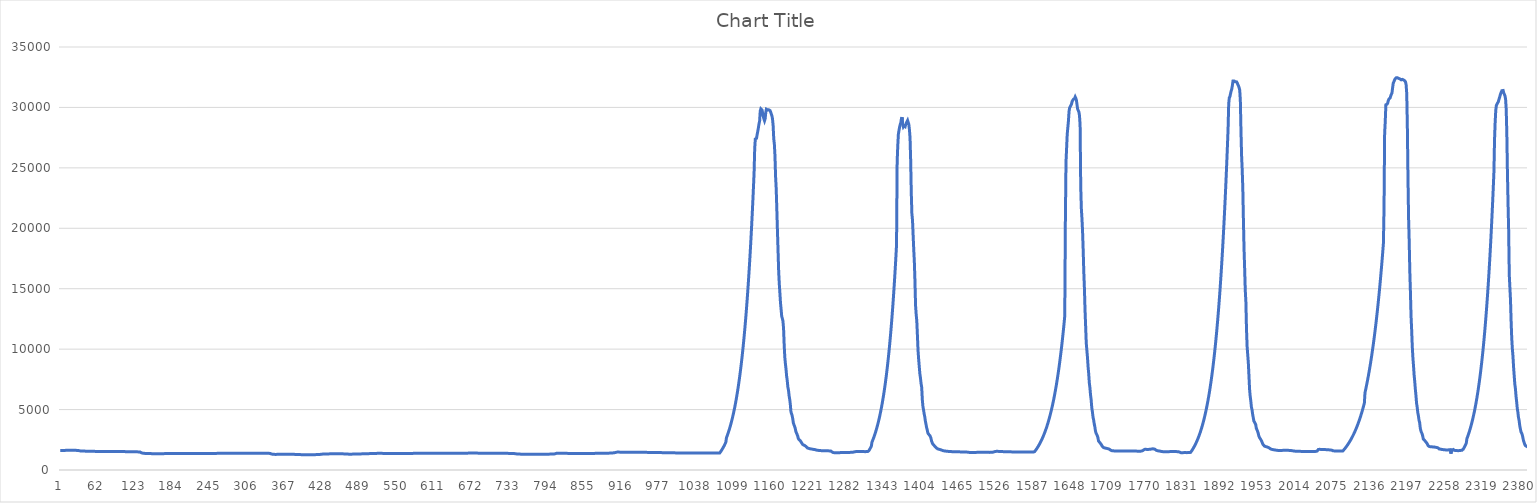
| Category | Series 0 |
|---|---|
| 0 | 1616 |
| 1 | 1617 |
| 2 | 1613 |
| 3 | 1615 |
| 4 | 1622 |
| 5 | 1622 |
| 6 | 1619 |
| 7 | 1623 |
| 8 | 1623 |
| 9 | 1626 |
| 10 | 1627 |
| 11 | 1625 |
| 12 | 1624 |
| 13 | 1625 |
| 14 | 1627 |
| 15 | 1626 |
| 16 | 1627 |
| 17 | 1627 |
| 18 | 1628 |
| 19 | 1628 |
| 20 | 1628 |
| 21 | 1628 |
| 22 | 1627 |
| 23 | 1627 |
| 24 | 1625 |
| 25 | 1623 |
| 26 | 1624 |
| 27 | 1622 |
| 28 | 1616 |
| 29 | 1611 |
| 30 | 1605 |
| 31 | 1596 |
| 32 | 1583 |
| 33 | 1577 |
| 34 | 1572 |
| 35 | 1569 |
| 36 | 1571 |
| 37 | 1567 |
| 38 | 1565 |
| 39 | 1562 |
| 40 | 1563 |
| 41 | 1561 |
| 42 | 1557 |
| 43 | 1554 |
| 44 | 1554 |
| 45 | 1551 |
| 46 | 1548 |
| 47 | 1545 |
| 48 | 1545 |
| 49 | 1547 |
| 50 | 1545 |
| 51 | 1546 |
| 52 | 1546 |
| 53 | 1543 |
| 54 | 1541 |
| 55 | 1541 |
| 56 | 1542 |
| 57 | 1541 |
| 58 | 1538 |
| 59 | 1538 |
| 60 | 1535 |
| 61 | 1535 |
| 62 | 1533 |
| 63 | 1532 |
| 64 | 1531 |
| 65 | 1531 |
| 66 | 1529 |
| 67 | 1528 |
| 68 | 1526 |
| 69 | 1525 |
| 70 | 1524 |
| 71 | 1523 |
| 72 | 1524 |
| 73 | 1524 |
| 74 | 1525 |
| 75 | 1527 |
| 76 | 1526 |
| 77 | 1527 |
| 78 | 1528 |
| 79 | 1528 |
| 80 | 1529 |
| 81 | 1529 |
| 82 | 1529 |
| 83 | 1530 |
| 84 | 1530 |
| 85 | 1531 |
| 86 | 1530 |
| 87 | 1531 |
| 88 | 1531 |
| 89 | 1531 |
| 90 | 1530 |
| 91 | 1531 |
| 92 | 1531 |
| 93 | 1530 |
| 94 | 1530 |
| 95 | 1529 |
| 96 | 1529 |
| 97 | 1528 |
| 98 | 1529 |
| 99 | 1529 |
| 100 | 1528 |
| 101 | 1528 |
| 102 | 1527 |
| 103 | 1527 |
| 104 | 1525 |
| 105 | 1524 |
| 106 | 1519 |
| 107 | 1510 |
| 108 | 1506 |
| 109 | 1501 |
| 110 | 1500 |
| 111 | 1498 |
| 112 | 1502 |
| 113 | 1505 |
| 114 | 1508 |
| 115 | 1510 |
| 116 | 1511 |
| 117 | 1509 |
| 118 | 1510 |
| 119 | 1511 |
| 120 | 1513 |
| 121 | 1511 |
| 122 | 1512 |
| 123 | 1510 |
| 124 | 1507 |
| 125 | 1503 |
| 126 | 1500 |
| 127 | 1497 |
| 128 | 1494 |
| 129 | 1490 |
| 130 | 1486 |
| 131 | 1474 |
| 132 | 1424 |
| 133 | 1412 |
| 134 | 1396 |
| 135 | 1385 |
| 136 | 1380 |
| 137 | 1377 |
| 138 | 1373 |
| 139 | 1371 |
| 140 | 1367 |
| 141 | 1368 |
| 142 | 1365 |
| 143 | 1366 |
| 144 | 1365 |
| 145 | 1363 |
| 146 | 1360 |
| 147 | 1357 |
| 148 | 1355 |
| 149 | 1354 |
| 150 | 1353 |
| 151 | 1352 |
| 152 | 1351 |
| 153 | 1348 |
| 154 | 1348 |
| 155 | 1348 |
| 156 | 1347 |
| 157 | 1347 |
| 158 | 1345 |
| 159 | 1345 |
| 160 | 1345 |
| 161 | 1346 |
| 162 | 1348 |
| 163 | 1351 |
| 164 | 1352 |
| 165 | 1354 |
| 166 | 1354 |
| 167 | 1354 |
| 168 | 1354 |
| 169 | 1354 |
| 170 | 1355 |
| 171 | 1355 |
| 172 | 1355 |
| 173 | 1355 |
| 174 | 1355 |
| 175 | 1356 |
| 176 | 1355 |
| 177 | 1356 |
| 178 | 1355 |
| 179 | 1355 |
| 180 | 1355 |
| 181 | 1355 |
| 182 | 1355 |
| 183 | 1356 |
| 184 | 1356 |
| 185 | 1355 |
| 186 | 1356 |
| 187 | 1355 |
| 188 | 1355 |
| 189 | 1355 |
| 190 | 1355 |
| 191 | 1355 |
| 192 | 1356 |
| 193 | 1357 |
| 194 | 1357 |
| 195 | 1358 |
| 196 | 1358 |
| 197 | 1359 |
| 198 | 1359 |
| 199 | 1360 |
| 200 | 1361 |
| 201 | 1361 |
| 202 | 1361 |
| 203 | 1362 |
| 204 | 1362 |
| 205 | 1362 |
| 206 | 1363 |
| 207 | 1364 |
| 208 | 1364 |
| 209 | 1365 |
| 210 | 1365 |
| 211 | 1365 |
| 212 | 1365 |
| 213 | 1365 |
| 214 | 1365 |
| 215 | 1364 |
| 216 | 1365 |
| 217 | 1365 |
| 218 | 1365 |
| 219 | 1366 |
| 220 | 1367 |
| 221 | 1367 |
| 222 | 1366 |
| 223 | 1367 |
| 224 | 1367 |
| 225 | 1367 |
| 226 | 1367 |
| 227 | 1367 |
| 228 | 1368 |
| 229 | 1368 |
| 230 | 1368 |
| 231 | 1368 |
| 232 | 1369 |
| 233 | 1369 |
| 234 | 1369 |
| 235 | 1369 |
| 236 | 1370 |
| 237 | 1368 |
| 238 | 1369 |
| 239 | 1368 |
| 240 | 1369 |
| 241 | 1369 |
| 242 | 1369 |
| 243 | 1370 |
| 244 | 1370 |
| 245 | 1370 |
| 246 | 1371 |
| 247 | 1371 |
| 248 | 1372 |
| 249 | 1372 |
| 250 | 1372 |
| 251 | 1373 |
| 252 | 1374 |
| 253 | 1375 |
| 254 | 1375 |
| 255 | 1376 |
| 256 | 1376 |
| 257 | 1376 |
| 258 | 1377 |
| 259 | 1378 |
| 260 | 1379 |
| 261 | 1380 |
| 262 | 1381 |
| 263 | 1382 |
| 264 | 1385 |
| 265 | 1387 |
| 266 | 1389 |
| 267 | 1391 |
| 268 | 1391 |
| 269 | 1392 |
| 270 | 1394 |
| 271 | 1395 |
| 272 | 1395 |
| 273 | 1395 |
| 274 | 1393 |
| 275 | 1395 |
| 276 | 1395 |
| 277 | 1396 |
| 278 | 1395 |
| 279 | 1394 |
| 280 | 1394 |
| 281 | 1393 |
| 282 | 1391 |
| 283 | 1390 |
| 284 | 1389 |
| 285 | 1388 |
| 286 | 1387 |
| 287 | 1387 |
| 288 | 1386 |
| 289 | 1385 |
| 290 | 1383 |
| 291 | 1382 |
| 292 | 1381 |
| 293 | 1380 |
| 294 | 1379 |
| 295 | 1379 |
| 296 | 1379 |
| 297 | 1378 |
| 298 | 1378 |
| 299 | 1377 |
| 300 | 1377 |
| 301 | 1377 |
| 302 | 1378 |
| 303 | 1378 |
| 304 | 1378 |
| 305 | 1378 |
| 306 | 1378 |
| 307 | 1379 |
| 308 | 1380 |
| 309 | 1381 |
| 310 | 1381 |
| 311 | 1383 |
| 312 | 1383 |
| 313 | 1384 |
| 314 | 1385 |
| 315 | 1385 |
| 316 | 1387 |
| 317 | 1387 |
| 318 | 1387 |
| 319 | 1387 |
| 320 | 1388 |
| 321 | 1388 |
| 322 | 1388 |
| 323 | 1388 |
| 324 | 1389 |
| 325 | 1389 |
| 326 | 1389 |
| 327 | 1389 |
| 328 | 1389 |
| 329 | 1389 |
| 330 | 1389 |
| 331 | 1388 |
| 332 | 1388 |
| 333 | 1387 |
| 334 | 1387 |
| 335 | 1386 |
| 336 | 1385 |
| 337 | 1384 |
| 338 | 1383 |
| 339 | 1381 |
| 340 | 1379 |
| 341 | 1377 |
| 342 | 1367 |
| 343 | 1319 |
| 344 | 1318 |
| 345 | 1316 |
| 346 | 1308 |
| 347 | 1295 |
| 348 | 1294 |
| 349 | 1290 |
| 350 | 1292 |
| 351 | 1293 |
| 352 | 1292 |
| 353 | 1294 |
| 354 | 1297 |
| 355 | 1298 |
| 356 | 1298 |
| 357 | 1298 |
| 358 | 1300 |
| 359 | 1302 |
| 360 | 1302 |
| 361 | 1303 |
| 362 | 1304 |
| 363 | 1305 |
| 364 | 1305 |
| 365 | 1306 |
| 366 | 1307 |
| 367 | 1306 |
| 368 | 1307 |
| 369 | 1305 |
| 370 | 1303 |
| 371 | 1303 |
| 372 | 1303 |
| 373 | 1303 |
| 374 | 1301 |
| 375 | 1301 |
| 376 | 1299 |
| 377 | 1298 |
| 378 | 1297 |
| 379 | 1296 |
| 380 | 1296 |
| 381 | 1295 |
| 382 | 1292 |
| 383 | 1291 |
| 384 | 1289 |
| 385 | 1287 |
| 386 | 1285 |
| 387 | 1284 |
| 388 | 1281 |
| 389 | 1280 |
| 390 | 1277 |
| 391 | 1275 |
| 392 | 1271 |
| 393 | 1269 |
| 394 | 1266 |
| 395 | 1262 |
| 396 | 1262 |
| 397 | 1261 |
| 398 | 1261 |
| 399 | 1262 |
| 400 | 1263 |
| 401 | 1262 |
| 402 | 1262 |
| 403 | 1262 |
| 404 | 1261 |
| 405 | 1261 |
| 406 | 1262 |
| 407 | 1263 |
| 408 | 1263 |
| 409 | 1263 |
| 410 | 1264 |
| 411 | 1266 |
| 412 | 1268 |
| 413 | 1269 |
| 414 | 1270 |
| 415 | 1270 |
| 416 | 1272 |
| 417 | 1273 |
| 418 | 1273 |
| 419 | 1274 |
| 420 | 1278 |
| 421 | 1280 |
| 422 | 1284 |
| 423 | 1293 |
| 424 | 1296 |
| 425 | 1306 |
| 426 | 1310 |
| 427 | 1314 |
| 428 | 1318 |
| 429 | 1324 |
| 430 | 1324 |
| 431 | 1324 |
| 432 | 1328 |
| 433 | 1327 |
| 434 | 1326 |
| 435 | 1329 |
| 436 | 1331 |
| 437 | 1332 |
| 438 | 1334 |
| 439 | 1334 |
| 440 | 1336 |
| 441 | 1337 |
| 442 | 1339 |
| 443 | 1340 |
| 444 | 1340 |
| 445 | 1342 |
| 446 | 1342 |
| 447 | 1342 |
| 448 | 1342 |
| 449 | 1342 |
| 450 | 1342 |
| 451 | 1342 |
| 452 | 1342 |
| 453 | 1341 |
| 454 | 1340 |
| 455 | 1340 |
| 456 | 1340 |
| 457 | 1338 |
| 458 | 1337 |
| 459 | 1336 |
| 460 | 1336 |
| 461 | 1335 |
| 462 | 1333 |
| 463 | 1333 |
| 464 | 1331 |
| 465 | 1329 |
| 466 | 1328 |
| 467 | 1325 |
| 468 | 1319 |
| 469 | 1316 |
| 470 | 1309 |
| 471 | 1308 |
| 472 | 1309 |
| 473 | 1308 |
| 474 | 1309 |
| 475 | 1311 |
| 476 | 1315 |
| 477 | 1319 |
| 478 | 1321 |
| 479 | 1321 |
| 480 | 1325 |
| 481 | 1325 |
| 482 | 1326 |
| 483 | 1327 |
| 484 | 1328 |
| 485 | 1329 |
| 486 | 1332 |
| 487 | 1331 |
| 488 | 1332 |
| 489 | 1334 |
| 490 | 1333 |
| 491 | 1335 |
| 492 | 1336 |
| 493 | 1337 |
| 494 | 1338 |
| 495 | 1340 |
| 496 | 1341 |
| 497 | 1342 |
| 498 | 1343 |
| 499 | 1344 |
| 500 | 1347 |
| 501 | 1349 |
| 502 | 1352 |
| 503 | 1354 |
| 504 | 1357 |
| 505 | 1358 |
| 506 | 1360 |
| 507 | 1363 |
| 508 | 1366 |
| 509 | 1368 |
| 510 | 1369 |
| 511 | 1371 |
| 512 | 1372 |
| 513 | 1373 |
| 514 | 1373 |
| 515 | 1374 |
| 516 | 1376 |
| 517 | 1377 |
| 518 | 1376 |
| 519 | 1377 |
| 520 | 1376 |
| 521 | 1376 |
| 522 | 1377 |
| 523 | 1376 |
| 524 | 1376 |
| 525 | 1374 |
| 526 | 1374 |
| 527 | 1373 |
| 528 | 1372 |
| 529 | 1371 |
| 530 | 1370 |
| 531 | 1368 |
| 532 | 1368 |
| 533 | 1367 |
| 534 | 1367 |
| 535 | 1367 |
| 536 | 1367 |
| 537 | 1367 |
| 538 | 1367 |
| 539 | 1367 |
| 540 | 1368 |
| 541 | 1368 |
| 542 | 1367 |
| 543 | 1367 |
| 544 | 1367 |
| 545 | 1365 |
| 546 | 1364 |
| 547 | 1364 |
| 548 | 1364 |
| 549 | 1364 |
| 550 | 1365 |
| 551 | 1365 |
| 552 | 1366 |
| 553 | 1365 |
| 554 | 1365 |
| 555 | 1365 |
| 556 | 1365 |
| 557 | 1366 |
| 558 | 1366 |
| 559 | 1366 |
| 560 | 1367 |
| 561 | 1367 |
| 562 | 1367 |
| 563 | 1368 |
| 564 | 1369 |
| 565 | 1370 |
| 566 | 1371 |
| 567 | 1372 |
| 568 | 1371 |
| 569 | 1372 |
| 570 | 1372 |
| 571 | 1373 |
| 572 | 1374 |
| 573 | 1375 |
| 574 | 1375 |
| 575 | 1376 |
| 576 | 1376 |
| 577 | 1377 |
| 578 | 1377 |
| 579 | 1378 |
| 580 | 1379 |
| 581 | 1380 |
| 582 | 1380 |
| 583 | 1382 |
| 584 | 1383 |
| 585 | 1384 |
| 586 | 1384 |
| 587 | 1386 |
| 588 | 1386 |
| 589 | 1386 |
| 590 | 1386 |
| 591 | 1387 |
| 592 | 1386 |
| 593 | 1387 |
| 594 | 1387 |
| 595 | 1387 |
| 596 | 1388 |
| 597 | 1387 |
| 598 | 1387 |
| 599 | 1388 |
| 600 | 1388 |
| 601 | 1387 |
| 602 | 1388 |
| 603 | 1388 |
| 604 | 1387 |
| 605 | 1386 |
| 606 | 1387 |
| 607 | 1386 |
| 608 | 1387 |
| 609 | 1387 |
| 610 | 1387 |
| 611 | 1387 |
| 612 | 1387 |
| 613 | 1387 |
| 614 | 1387 |
| 615 | 1387 |
| 616 | 1386 |
| 617 | 1386 |
| 618 | 1387 |
| 619 | 1386 |
| 620 | 1386 |
| 621 | 1386 |
| 622 | 1386 |
| 623 | 1387 |
| 624 | 1388 |
| 625 | 1387 |
| 626 | 1387 |
| 627 | 1387 |
| 628 | 1387 |
| 629 | 1388 |
| 630 | 1388 |
| 631 | 1388 |
| 632 | 1388 |
| 633 | 1388 |
| 634 | 1388 |
| 635 | 1388 |
| 636 | 1388 |
| 637 | 1388 |
| 638 | 1389 |
| 639 | 1389 |
| 640 | 1389 |
| 641 | 1388 |
| 642 | 1388 |
| 643 | 1389 |
| 644 | 1389 |
| 645 | 1390 |
| 646 | 1390 |
| 647 | 1390 |
| 648 | 1390 |
| 649 | 1390 |
| 650 | 1391 |
| 651 | 1392 |
| 652 | 1392 |
| 653 | 1392 |
| 654 | 1392 |
| 655 | 1392 |
| 656 | 1393 |
| 657 | 1393 |
| 658 | 1394 |
| 659 | 1394 |
| 660 | 1394 |
| 661 | 1395 |
| 662 | 1396 |
| 663 | 1396 |
| 664 | 1396 |
| 665 | 1397 |
| 666 | 1397 |
| 667 | 1398 |
| 668 | 1398 |
| 669 | 1398 |
| 670 | 1397 |
| 671 | 1397 |
| 672 | 1397 |
| 673 | 1397 |
| 674 | 1397 |
| 675 | 1397 |
| 676 | 1397 |
| 677 | 1397 |
| 678 | 1397 |
| 679 | 1397 |
| 680 | 1396 |
| 681 | 1396 |
| 682 | 1396 |
| 683 | 1396 |
| 684 | 1395 |
| 685 | 1395 |
| 686 | 1395 |
| 687 | 1394 |
| 688 | 1393 |
| 689 | 1392 |
| 690 | 1391 |
| 691 | 1391 |
| 692 | 1390 |
| 693 | 1390 |
| 694 | 1390 |
| 695 | 1389 |
| 696 | 1389 |
| 697 | 1388 |
| 698 | 1388 |
| 699 | 1388 |
| 700 | 1388 |
| 701 | 1387 |
| 702 | 1387 |
| 703 | 1386 |
| 704 | 1386 |
| 705 | 1385 |
| 706 | 1385 |
| 707 | 1385 |
| 708 | 1385 |
| 709 | 1384 |
| 710 | 1384 |
| 711 | 1384 |
| 712 | 1384 |
| 713 | 1383 |
| 714 | 1382 |
| 715 | 1383 |
| 716 | 1382 |
| 717 | 1381 |
| 718 | 1381 |
| 719 | 1381 |
| 720 | 1381 |
| 721 | 1380 |
| 722 | 1379 |
| 723 | 1379 |
| 724 | 1379 |
| 725 | 1379 |
| 726 | 1378 |
| 727 | 1378 |
| 728 | 1377 |
| 729 | 1376 |
| 730 | 1375 |
| 731 | 1374 |
| 732 | 1373 |
| 733 | 1371 |
| 734 | 1369 |
| 735 | 1368 |
| 736 | 1366 |
| 737 | 1364 |
| 738 | 1362 |
| 739 | 1357 |
| 740 | 1355 |
| 741 | 1350 |
| 742 | 1340 |
| 743 | 1331 |
| 744 | 1326 |
| 745 | 1324 |
| 746 | 1320 |
| 747 | 1318 |
| 748 | 1318 |
| 749 | 1315 |
| 750 | 1311 |
| 751 | 1309 |
| 752 | 1309 |
| 753 | 1310 |
| 754 | 1310 |
| 755 | 1310 |
| 756 | 1312 |
| 757 | 1311 |
| 758 | 1311 |
| 759 | 1311 |
| 760 | 1311 |
| 761 | 1312 |
| 762 | 1310 |
| 763 | 1309 |
| 764 | 1307 |
| 765 | 1307 |
| 766 | 1305 |
| 767 | 1305 |
| 768 | 1303 |
| 769 | 1303 |
| 770 | 1300 |
| 771 | 1300 |
| 772 | 1299 |
| 773 | 1299 |
| 774 | 1298 |
| 775 | 1298 |
| 776 | 1297 |
| 777 | 1297 |
| 778 | 1297 |
| 779 | 1298 |
| 780 | 1298 |
| 781 | 1298 |
| 782 | 1298 |
| 783 | 1299 |
| 784 | 1299 |
| 785 | 1300 |
| 786 | 1301 |
| 787 | 1302 |
| 788 | 1303 |
| 789 | 1304 |
| 790 | 1305 |
| 791 | 1306 |
| 792 | 1307 |
| 793 | 1309 |
| 794 | 1310 |
| 795 | 1311 |
| 796 | 1313 |
| 797 | 1313 |
| 798 | 1314 |
| 799 | 1315 |
| 800 | 1316 |
| 801 | 1316 |
| 802 | 1318 |
| 803 | 1321 |
| 804 | 1322 |
| 805 | 1325 |
| 806 | 1344 |
| 807 | 1375 |
| 808 | 1383 |
| 809 | 1389 |
| 810 | 1391 |
| 811 | 1391 |
| 812 | 1390 |
| 813 | 1389 |
| 814 | 1391 |
| 815 | 1388 |
| 816 | 1387 |
| 817 | 1386 |
| 818 | 1387 |
| 819 | 1387 |
| 820 | 1390 |
| 821 | 1390 |
| 822 | 1391 |
| 823 | 1388 |
| 824 | 1383 |
| 825 | 1380 |
| 826 | 1376 |
| 827 | 1373 |
| 828 | 1372 |
| 829 | 1369 |
| 830 | 1368 |
| 831 | 1365 |
| 832 | 1365 |
| 833 | 1364 |
| 834 | 1362 |
| 835 | 1360 |
| 836 | 1359 |
| 837 | 1359 |
| 838 | 1360 |
| 839 | 1360 |
| 840 | 1360 |
| 841 | 1359 |
| 842 | 1358 |
| 843 | 1358 |
| 844 | 1358 |
| 845 | 1360 |
| 846 | 1359 |
| 847 | 1360 |
| 848 | 1361 |
| 849 | 1363 |
| 850 | 1363 |
| 851 | 1362 |
| 852 | 1362 |
| 853 | 1363 |
| 854 | 1364 |
| 855 | 1366 |
| 856 | 1367 |
| 857 | 1368 |
| 858 | 1369 |
| 859 | 1369 |
| 860 | 1369 |
| 861 | 1371 |
| 862 | 1371 |
| 863 | 1371 |
| 864 | 1371 |
| 865 | 1372 |
| 866 | 1373 |
| 867 | 1373 |
| 868 | 1374 |
| 869 | 1374 |
| 870 | 1375 |
| 871 | 1375 |
| 872 | 1376 |
| 873 | 1376 |
| 874 | 1377 |
| 875 | 1378 |
| 876 | 1379 |
| 877 | 1380 |
| 878 | 1380 |
| 879 | 1380 |
| 880 | 1380 |
| 881 | 1381 |
| 882 | 1382 |
| 883 | 1382 |
| 884 | 1382 |
| 885 | 1383 |
| 886 | 1383 |
| 887 | 1384 |
| 888 | 1386 |
| 889 | 1387 |
| 890 | 1388 |
| 891 | 1389 |
| 892 | 1391 |
| 893 | 1394 |
| 894 | 1396 |
| 895 | 1397 |
| 896 | 1401 |
| 897 | 1405 |
| 898 | 1408 |
| 899 | 1411 |
| 900 | 1415 |
| 901 | 1418 |
| 902 | 1424 |
| 903 | 1431 |
| 904 | 1444 |
| 905 | 1461 |
| 906 | 1475 |
| 907 | 1481 |
| 908 | 1486 |
| 909 | 1487 |
| 910 | 1481 |
| 911 | 1477 |
| 912 | 1476 |
| 913 | 1475 |
| 914 | 1471 |
| 915 | 1470 |
| 916 | 1469 |
| 917 | 1467 |
| 918 | 1466 |
| 919 | 1466 |
| 920 | 1467 |
| 921 | 1468 |
| 922 | 1468 |
| 923 | 1468 |
| 924 | 1466 |
| 925 | 1465 |
| 926 | 1465 |
| 927 | 1466 |
| 928 | 1469 |
| 929 | 1470 |
| 930 | 1470 |
| 931 | 1470 |
| 932 | 1469 |
| 933 | 1469 |
| 934 | 1469 |
| 935 | 1469 |
| 936 | 1470 |
| 937 | 1471 |
| 938 | 1472 |
| 939 | 1473 |
| 940 | 1472 |
| 941 | 1471 |
| 942 | 1468 |
| 943 | 1468 |
| 944 | 1468 |
| 945 | 1468 |
| 946 | 1467 |
| 947 | 1465 |
| 948 | 1464 |
| 949 | 1464 |
| 950 | 1463 |
| 951 | 1462 |
| 952 | 1462 |
| 953 | 1461 |
| 954 | 1460 |
| 955 | 1459 |
| 956 | 1458 |
| 957 | 1457 |
| 958 | 1456 |
| 959 | 1455 |
| 960 | 1454 |
| 961 | 1453 |
| 962 | 1452 |
| 963 | 1451 |
| 964 | 1451 |
| 965 | 1450 |
| 966 | 1449 |
| 967 | 1448 |
| 968 | 1447 |
| 969 | 1446 |
| 970 | 1445 |
| 971 | 1444 |
| 972 | 1443 |
| 973 | 1443 |
| 974 | 1442 |
| 975 | 1441 |
| 976 | 1440 |
| 977 | 1440 |
| 978 | 1439 |
| 979 | 1438 |
| 980 | 1437 |
| 981 | 1436 |
| 982 | 1435 |
| 983 | 1433 |
| 984 | 1432 |
| 985 | 1431 |
| 986 | 1430 |
| 987 | 1429 |
| 988 | 1428 |
| 989 | 1426 |
| 990 | 1426 |
| 991 | 1424 |
| 992 | 1424 |
| 993 | 1422 |
| 994 | 1421 |
| 995 | 1422 |
| 996 | 1420 |
| 997 | 1420 |
| 998 | 1419 |
| 999 | 1419 |
| 1000 | 1419 |
| 1001 | 1417 |
| 1002 | 1416 |
| 1003 | 1416 |
| 1004 | 1415 |
| 1005 | 1413 |
| 1006 | 1412 |
| 1007 | 1412 |
| 1008 | 1410 |
| 1009 | 1411 |
| 1010 | 1411 |
| 1011 | 1410 |
| 1012 | 1410 |
| 1013 | 1409 |
| 1014 | 1409 |
| 1015 | 1408 |
| 1016 | 1407 |
| 1017 | 1407 |
| 1018 | 1406 |
| 1019 | 1405 |
| 1020 | 1404 |
| 1021 | 1405 |
| 1022 | 1405 |
| 1023 | 1404 |
| 1024 | 1404 |
| 1025 | 1404 |
| 1026 | 1403 |
| 1027 | 1403 |
| 1028 | 1404 |
| 1029 | 1403 |
| 1030 | 1403 |
| 1031 | 1403 |
| 1032 | 1402 |
| 1033 | 1402 |
| 1034 | 1401 |
| 1035 | 1402 |
| 1036 | 1402 |
| 1037 | 1402 |
| 1038 | 1401 |
| 1039 | 1401 |
| 1040 | 1401 |
| 1041 | 1402 |
| 1042 | 1401 |
| 1043 | 1401 |
| 1044 | 1401 |
| 1045 | 1402 |
| 1046 | 1402 |
| 1047 | 1402 |
| 1048 | 1402 |
| 1049 | 1402 |
| 1050 | 1402 |
| 1051 | 1402 |
| 1052 | 1402 |
| 1053 | 1403 |
| 1054 | 1404 |
| 1055 | 1403 |
| 1056 | 1404 |
| 1057 | 1404 |
| 1058 | 1404 |
| 1059 | 1404 |
| 1060 | 1404 |
| 1061 | 1404 |
| 1062 | 1405 |
| 1063 | 1405 |
| 1064 | 1405 |
| 1065 | 1405 |
| 1066 | 1405 |
| 1067 | 1405 |
| 1068 | 1404 |
| 1069 | 1405 |
| 1070 | 1405 |
| 1071 | 1406 |
| 1072 | 1405 |
| 1073 | 1405 |
| 1074 | 1405 |
| 1075 | 1476.091 |
| 1076 | 1550.778 |
| 1077 | 1629.245 |
| 1078 | 1711.682 |
| 1079 | 1798.291 |
| 1080 | 1889.281 |
| 1081 | 1984.876 |
| 1082 | 2085.307 |
| 1083 | 2190.82 |
| 1084 | 2301.672 |
| 1085 | 2669.031 |
| 1086 | 2804.079 |
| 1087 | 2945.961 |
| 1088 | 3095.022 |
| 1089 | 3251.625 |
| 1090 | 3416.152 |
| 1091 | 3589.004 |
| 1092 | 3770.601 |
| 1093 | 3961.387 |
| 1094 | 4161.827 |
| 1095 | 4372.409 |
| 1096 | 4593.645 |
| 1097 | 4826.076 |
| 1098 | 5070.268 |
| 1099 | 5326.815 |
| 1100 | 5596.343 |
| 1101 | 5879.508 |
| 1102 | 6177.002 |
| 1103 | 6489.548 |
| 1104 | 6817.908 |
| 1105 | 7162.883 |
| 1106 | 7525.313 |
| 1107 | 7906.082 |
| 1108 | 8306.116 |
| 1109 | 8726.392 |
| 1110 | 9167.933 |
| 1111 | 9631.816 |
| 1112 | 10119.17 |
| 1113 | 10631.183 |
| 1114 | 11169.103 |
| 1115 | 11734.241 |
| 1116 | 12327.974 |
| 1117 | 12951.75 |
| 1118 | 13607.087 |
| 1119 | 14295.583 |
| 1120 | 15018.916 |
| 1121 | 15778.848 |
| 1122 | 16577.232 |
| 1123 | 17416.012 |
| 1124 | 18297.234 |
| 1125 | 19223.044 |
| 1126 | 20195.698 |
| 1127 | 21217.567 |
| 1128 | 22291.141 |
| 1129 | 23419.035 |
| 1130 | 24604 |
| 1131 | 26595 |
| 1132 | 27385 |
| 1133 | 27335 |
| 1134 | 27450 |
| 1135 | 27761 |
| 1136 | 28021 |
| 1137 | 28320 |
| 1138 | 28636 |
| 1139 | 28872 |
| 1140 | 29697 |
| 1141 | 29882 |
| 1142 | 29832 |
| 1143 | 29773 |
| 1144 | 29512 |
| 1145 | 29245 |
| 1146 | 29052 |
| 1147 | 28898 |
| 1148 | 29064 |
| 1149 | 29566 |
| 1150 | 29853 |
| 1151 | 29918 |
| 1152 | 29794 |
| 1153 | 29828 |
| 1154 | 29802 |
| 1155 | 29805 |
| 1156 | 29743 |
| 1157 | 29610 |
| 1158 | 29460 |
| 1159 | 29311 |
| 1160 | 29048 |
| 1161 | 28499 |
| 1162 | 27417 |
| 1163 | 26968 |
| 1164 | 26012 |
| 1165 | 24288 |
| 1166 | 23293 |
| 1167 | 21620 |
| 1168 | 19843 |
| 1169 | 18192 |
| 1170 | 16486 |
| 1171 | 15433 |
| 1172 | 14657 |
| 1173 | 13835 |
| 1174 | 13295 |
| 1175 | 12713 |
| 1176 | 12545 |
| 1177 | 12326 |
| 1178 | 11709 |
| 1179 | 10371 |
| 1180 | 9350 |
| 1181 | 8798 |
| 1182 | 8350 |
| 1183 | 7757 |
| 1184 | 7398 |
| 1185 | 6861 |
| 1186 | 6615 |
| 1187 | 6160 |
| 1188 | 5857 |
| 1189 | 5437 |
| 1190 | 4822 |
| 1191 | 4658 |
| 1192 | 4494 |
| 1193 | 4234 |
| 1194 | 3878 |
| 1195 | 3733 |
| 1196 | 3611 |
| 1197 | 3453 |
| 1198 | 3193 |
| 1199 | 3066 |
| 1200 | 2956 |
| 1201 | 2812 |
| 1202 | 2612 |
| 1203 | 2525 |
| 1204 | 2491 |
| 1205 | 2441 |
| 1206 | 2393 |
| 1207 | 2281 |
| 1208 | 2201 |
| 1209 | 2120 |
| 1210 | 2088 |
| 1211 | 2061 |
| 1212 | 2048 |
| 1213 | 2012 |
| 1214 | 1990 |
| 1215 | 1915 |
| 1216 | 1851 |
| 1217 | 1817 |
| 1218 | 1787 |
| 1219 | 1792 |
| 1220 | 1775 |
| 1221 | 1754 |
| 1222 | 1748 |
| 1223 | 1742 |
| 1224 | 1729 |
| 1225 | 1723 |
| 1226 | 1714 |
| 1227 | 1703 |
| 1228 | 1694 |
| 1229 | 1688 |
| 1230 | 1670 |
| 1231 | 1656 |
| 1232 | 1646 |
| 1233 | 1634 |
| 1234 | 1627 |
| 1235 | 1621 |
| 1236 | 1618 |
| 1237 | 1612 |
| 1238 | 1607 |
| 1239 | 1603 |
| 1240 | 1599 |
| 1241 | 1595 |
| 1242 | 1594 |
| 1243 | 1596 |
| 1244 | 1595 |
| 1245 | 1594 |
| 1246 | 1593 |
| 1247 | 1592 |
| 1248 | 1590 |
| 1249 | 1588 |
| 1250 | 1586 |
| 1251 | 1585 |
| 1252 | 1579 |
| 1253 | 1575 |
| 1254 | 1572 |
| 1255 | 1566 |
| 1256 | 1552 |
| 1257 | 1496 |
| 1258 | 1430 |
| 1259 | 1439 |
| 1260 | 1431 |
| 1261 | 1434 |
| 1262 | 1425 |
| 1263 | 1429 |
| 1264 | 1427 |
| 1265 | 1428 |
| 1266 | 1428 |
| 1267 | 1429 |
| 1268 | 1433 |
| 1269 | 1434 |
| 1270 | 1436 |
| 1271 | 1440 |
| 1272 | 1443 |
| 1273 | 1443 |
| 1274 | 1447 |
| 1275 | 1446 |
| 1276 | 1446 |
| 1277 | 1449 |
| 1278 | 1449 |
| 1279 | 1451 |
| 1280 | 1452 |
| 1281 | 1452 |
| 1282 | 1453 |
| 1283 | 1453 |
| 1284 | 1454 |
| 1285 | 1456 |
| 1286 | 1457 |
| 1287 | 1459 |
| 1288 | 1462 |
| 1289 | 1466 |
| 1290 | 1469 |
| 1291 | 1473 |
| 1292 | 1481 |
| 1293 | 1495 |
| 1294 | 1507 |
| 1295 | 1518 |
| 1296 | 1520 |
| 1297 | 1528 |
| 1298 | 1532 |
| 1299 | 1534 |
| 1300 | 1534 |
| 1301 | 1534 |
| 1302 | 1531 |
| 1303 | 1531 |
| 1304 | 1532 |
| 1305 | 1529 |
| 1306 | 1527 |
| 1307 | 1526 |
| 1308 | 1524 |
| 1309 | 1521 |
| 1310 | 1520 |
| 1311 | 1519 |
| 1312 | 1520 |
| 1313 | 1523 |
| 1314 | 1521 |
| 1315 | 1523 |
| 1316 | 1522 |
| 1317 | 1603.501 |
| 1318 | 1689.365 |
| 1319 | 1779.828 |
| 1320 | 1875.135 |
| 1321 | 1975.545 |
| 1322 | 2310.204 |
| 1323 | 2433.912 |
| 1324 | 2564.244 |
| 1325 | 2701.555 |
| 1326 | 2846.218 |
| 1327 | 2998.629 |
| 1328 | 3159.2 |
| 1329 | 3328.37 |
| 1330 | 3506.599 |
| 1331 | 3694.371 |
| 1332 | 3892.199 |
| 1333 | 4100.62 |
| 1334 | 4320.201 |
| 1335 | 4551.54 |
| 1336 | 4795.268 |
| 1337 | 5052.046 |
| 1338 | 5322.575 |
| 1339 | 5607.59 |
| 1340 | 5907.867 |
| 1341 | 6224.224 |
| 1342 | 6557.52 |
| 1343 | 6908.665 |
| 1344 | 7278.612 |
| 1345 | 7668.37 |
| 1346 | 8078.998 |
| 1347 | 8511.615 |
| 1348 | 8967.398 |
| 1349 | 9447.587 |
| 1350 | 9953.49 |
| 1351 | 10486.482 |
| 1352 | 11048.016 |
| 1353 | 11639.619 |
| 1354 | 12262.901 |
| 1355 | 12919.559 |
| 1356 | 13611.38 |
| 1357 | 14340.247 |
| 1358 | 15108.143 |
| 1359 | 15917.159 |
| 1360 | 16769.496 |
| 1361 | 17667.475 |
| 1362 | 18613.538 |
| 1363 | 25453.982 |
| 1364 | 26817 |
| 1365 | 27780 |
| 1366 | 28085 |
| 1367 | 28384 |
| 1368 | 28583 |
| 1369 | 28740 |
| 1370 | 29068 |
| 1371 | 29191 |
| 1372 | 28586 |
| 1373 | 28398 |
| 1374 | 28481 |
| 1375 | 28430 |
| 1376 | 28408 |
| 1377 | 28595 |
| 1378 | 28658 |
| 1379 | 28830 |
| 1380 | 28929 |
| 1381 | 28868 |
| 1382 | 28602 |
| 1383 | 28162 |
| 1384 | 27490 |
| 1385 | 25668 |
| 1386 | 22964 |
| 1387 | 21220 |
| 1388 | 20683 |
| 1389 | 19473 |
| 1390 | 18290 |
| 1391 | 17250 |
| 1392 | 15643 |
| 1393 | 13610 |
| 1394 | 12871 |
| 1395 | 12336 |
| 1396 | 11158 |
| 1397 | 9913 |
| 1398 | 9193 |
| 1399 | 8570 |
| 1400 | 7956 |
| 1401 | 7605 |
| 1402 | 7140 |
| 1403 | 6832 |
| 1404 | 5817 |
| 1405 | 5245 |
| 1406 | 4986 |
| 1407 | 4639 |
| 1408 | 4404 |
| 1409 | 4034 |
| 1410 | 3791 |
| 1411 | 3509 |
| 1412 | 3324 |
| 1413 | 3066 |
| 1414 | 2977 |
| 1415 | 2924 |
| 1416 | 2865 |
| 1417 | 2775 |
| 1418 | 2641 |
| 1419 | 2411 |
| 1420 | 2267 |
| 1421 | 2158 |
| 1422 | 2091 |
| 1423 | 2043 |
| 1424 | 1979 |
| 1425 | 1921 |
| 1426 | 1870 |
| 1427 | 1823 |
| 1428 | 1777 |
| 1429 | 1747 |
| 1430 | 1729 |
| 1431 | 1718 |
| 1432 | 1705 |
| 1433 | 1687 |
| 1434 | 1678 |
| 1435 | 1657 |
| 1436 | 1641 |
| 1437 | 1613 |
| 1438 | 1606 |
| 1439 | 1587 |
| 1440 | 1583 |
| 1441 | 1571 |
| 1442 | 1563 |
| 1443 | 1556 |
| 1444 | 1552 |
| 1445 | 1547 |
| 1446 | 1538 |
| 1447 | 1533 |
| 1448 | 1532 |
| 1449 | 1528 |
| 1450 | 1527 |
| 1451 | 1523 |
| 1452 | 1519 |
| 1453 | 1516 |
| 1454 | 1519 |
| 1455 | 1519 |
| 1456 | 1515 |
| 1457 | 1513 |
| 1458 | 1512 |
| 1459 | 1511 |
| 1460 | 1509 |
| 1461 | 1509 |
| 1462 | 1507 |
| 1463 | 1504 |
| 1464 | 1503 |
| 1465 | 1500 |
| 1466 | 1499 |
| 1467 | 1498 |
| 1468 | 1496 |
| 1469 | 1494 |
| 1470 | 1494 |
| 1471 | 1492 |
| 1472 | 1490 |
| 1473 | 1488 |
| 1474 | 1486 |
| 1475 | 1485 |
| 1476 | 1483 |
| 1477 | 1480 |
| 1478 | 1473 |
| 1479 | 1465 |
| 1480 | 1461 |
| 1481 | 1453 |
| 1482 | 1446 |
| 1483 | 1450 |
| 1484 | 1452 |
| 1485 | 1451 |
| 1486 | 1455 |
| 1487 | 1455 |
| 1488 | 1456 |
| 1489 | 1455 |
| 1490 | 1456 |
| 1491 | 1457 |
| 1492 | 1460 |
| 1493 | 1459 |
| 1494 | 1457 |
| 1495 | 1461 |
| 1496 | 1461 |
| 1497 | 1464 |
| 1498 | 1466 |
| 1499 | 1466 |
| 1500 | 1467 |
| 1501 | 1469 |
| 1502 | 1471 |
| 1503 | 1472 |
| 1504 | 1472 |
| 1505 | 1471 |
| 1506 | 1470 |
| 1507 | 1469 |
| 1508 | 1468 |
| 1509 | 1466 |
| 1510 | 1463 |
| 1511 | 1461 |
| 1512 | 1459 |
| 1513 | 1458 |
| 1514 | 1458 |
| 1515 | 1459 |
| 1516 | 1459 |
| 1517 | 1465 |
| 1518 | 1470 |
| 1519 | 1477 |
| 1520 | 1487 |
| 1521 | 1506 |
| 1522 | 1536 |
| 1523 | 1535 |
| 1524 | 1537 |
| 1525 | 1544 |
| 1526 | 1546 |
| 1527 | 1542 |
| 1528 | 1538 |
| 1529 | 1539 |
| 1530 | 1535 |
| 1531 | 1532 |
| 1532 | 1529 |
| 1533 | 1527 |
| 1534 | 1524 |
| 1535 | 1521 |
| 1536 | 1518 |
| 1537 | 1516 |
| 1538 | 1514 |
| 1539 | 1513 |
| 1540 | 1513 |
| 1541 | 1512 |
| 1542 | 1510 |
| 1543 | 1509 |
| 1544 | 1509 |
| 1545 | 1507 |
| 1546 | 1506 |
| 1547 | 1503 |
| 1548 | 1501 |
| 1549 | 1500 |
| 1550 | 1497 |
| 1551 | 1497 |
| 1552 | 1498 |
| 1553 | 1497 |
| 1554 | 1498 |
| 1555 | 1498 |
| 1556 | 1497 |
| 1557 | 1498 |
| 1558 | 1498 |
| 1559 | 1498 |
| 1560 | 1497 |
| 1561 | 1497 |
| 1562 | 1498 |
| 1563 | 1498 |
| 1564 | 1497 |
| 1565 | 1497 |
| 1566 | 1496 |
| 1567 | 1495 |
| 1568 | 1496 |
| 1569 | 1495 |
| 1570 | 1495 |
| 1571 | 1494 |
| 1572 | 1495 |
| 1573 | 1493 |
| 1574 | 1494 |
| 1575 | 1494 |
| 1576 | 1494 |
| 1577 | 1492 |
| 1578 | 1491 |
| 1579 | 1490 |
| 1580 | 1489 |
| 1581 | 1488 |
| 1582 | 1488 |
| 1583 | 1486 |
| 1584 | 1485 |
| 1585 | 1485 |
| 1586 | 1493 |
| 1587 | 1525 |
| 1588 | 1592.513 |
| 1589 | 1663.014 |
| 1590 | 1736.637 |
| 1591 | 1813.519 |
| 1592 | 1893.804 |
| 1593 | 1977.644 |
| 1594 | 2065.195 |
| 1595 | 2156.623 |
| 1596 | 2252.098 |
| 1597 | 2351.799 |
| 1598 | 2455.915 |
| 1599 | 2564.64 |
| 1600 | 2678.178 |
| 1601 | 2796.742 |
| 1602 | 2920.556 |
| 1603 | 3049.85 |
| 1604 | 3184.869 |
| 1605 | 3325.865 |
| 1606 | 3473.103 |
| 1607 | 3626.859 |
| 1608 | 3787.422 |
| 1609 | 3955.094 |
| 1610 | 4130.188 |
| 1611 | 4313.034 |
| 1612 | 4503.974 |
| 1613 | 4703.368 |
| 1614 | 4911.589 |
| 1615 | 5129.027 |
| 1616 | 5356.092 |
| 1617 | 5593.21 |
| 1618 | 5840.824 |
| 1619 | 6099.401 |
| 1620 | 6369.425 |
| 1621 | 6651.403 |
| 1622 | 6945.865 |
| 1623 | 7253.362 |
| 1624 | 7574.473 |
| 1625 | 7909.799 |
| 1626 | 8259.97 |
| 1627 | 8625.644 |
| 1628 | 9007.506 |
| 1629 | 9406.274 |
| 1630 | 9822.695 |
| 1631 | 10257.551 |
| 1632 | 10711.659 |
| 1633 | 11185.87 |
| 1634 | 11681.075 |
| 1635 | 12198.203 |
| 1636 | 12738.225 |
| 1637 | 20514.095 |
| 1638 | 25475.198 |
| 1639 | 26603 |
| 1640 | 27776 |
| 1641 | 28327 |
| 1642 | 28884 |
| 1643 | 29682 |
| 1644 | 29979 |
| 1645 | 30019 |
| 1646 | 30162 |
| 1647 | 30280 |
| 1648 | 30497 |
| 1649 | 30559 |
| 1650 | 30667 |
| 1651 | 30688 |
| 1652 | 30745 |
| 1653 | 30872 |
| 1654 | 30767 |
| 1655 | 30594 |
| 1656 | 30210 |
| 1657 | 29860 |
| 1658 | 29790 |
| 1659 | 29624 |
| 1660 | 29325 |
| 1661 | 28522 |
| 1662 | 23470 |
| 1663 | 21656 |
| 1664 | 20818 |
| 1665 | 19758 |
| 1666 | 18209 |
| 1667 | 16408 |
| 1668 | 15055 |
| 1669 | 13259 |
| 1670 | 11914 |
| 1671 | 10514 |
| 1672 | 9910 |
| 1673 | 9317 |
| 1674 | 8541 |
| 1675 | 7978 |
| 1676 | 7205 |
| 1677 | 6795 |
| 1678 | 6198 |
| 1679 | 5796 |
| 1680 | 5147 |
| 1681 | 4824 |
| 1682 | 4384 |
| 1683 | 4150 |
| 1684 | 3822 |
| 1685 | 3575 |
| 1686 | 3227 |
| 1687 | 3046 |
| 1688 | 2948 |
| 1689 | 2836 |
| 1690 | 2678 |
| 1691 | 2407 |
| 1692 | 2328 |
| 1693 | 2271 |
| 1694 | 2200 |
| 1695 | 2145 |
| 1696 | 2057 |
| 1697 | 1969 |
| 1698 | 1911 |
| 1699 | 1861 |
| 1700 | 1837 |
| 1701 | 1826 |
| 1702 | 1817 |
| 1703 | 1801 |
| 1704 | 1793 |
| 1705 | 1780 |
| 1706 | 1769 |
| 1707 | 1754 |
| 1708 | 1737 |
| 1709 | 1707 |
| 1710 | 1644 |
| 1711 | 1635 |
| 1712 | 1592 |
| 1713 | 1594 |
| 1714 | 1585 |
| 1715 | 1587 |
| 1716 | 1585 |
| 1717 | 1578 |
| 1718 | 1578 |
| 1719 | 1575 |
| 1720 | 1571 |
| 1721 | 1574 |
| 1722 | 1572 |
| 1723 | 1575 |
| 1724 | 1576 |
| 1725 | 1573 |
| 1726 | 1573 |
| 1727 | 1574 |
| 1728 | 1575 |
| 1729 | 1573 |
| 1730 | 1573 |
| 1731 | 1573 |
| 1732 | 1572 |
| 1733 | 1574 |
| 1734 | 1569 |
| 1735 | 1565 |
| 1736 | 1563 |
| 1737 | 1563 |
| 1738 | 1562 |
| 1739 | 1563 |
| 1740 | 1562 |
| 1741 | 1562 |
| 1742 | 1564 |
| 1743 | 1566 |
| 1744 | 1567 |
| 1745 | 1567 |
| 1746 | 1567 |
| 1747 | 1567 |
| 1748 | 1568 |
| 1749 | 1567 |
| 1750 | 1566 |
| 1751 | 1565 |
| 1752 | 1565 |
| 1753 | 1562 |
| 1754 | 1560 |
| 1755 | 1560 |
| 1756 | 1558 |
| 1757 | 1557 |
| 1758 | 1558 |
| 1759 | 1557 |
| 1760 | 1561 |
| 1761 | 1566 |
| 1762 | 1576 |
| 1763 | 1602 |
| 1764 | 1656 |
| 1765 | 1678 |
| 1766 | 1705 |
| 1767 | 1720 |
| 1768 | 1710 |
| 1769 | 1705 |
| 1770 | 1695 |
| 1771 | 1697 |
| 1772 | 1704 |
| 1773 | 1707 |
| 1774 | 1708 |
| 1775 | 1719 |
| 1776 | 1726 |
| 1777 | 1731 |
| 1778 | 1743 |
| 1779 | 1751 |
| 1780 | 1755 |
| 1781 | 1746 |
| 1782 | 1730 |
| 1783 | 1713 |
| 1784 | 1696 |
| 1785 | 1630 |
| 1786 | 1600 |
| 1787 | 1594 |
| 1788 | 1592 |
| 1789 | 1576 |
| 1790 | 1578 |
| 1791 | 1564 |
| 1792 | 1555 |
| 1793 | 1538 |
| 1794 | 1529 |
| 1795 | 1524 |
| 1796 | 1516 |
| 1797 | 1506 |
| 1798 | 1505 |
| 1799 | 1500 |
| 1800 | 1497 |
| 1801 | 1503 |
| 1802 | 1504 |
| 1803 | 1506 |
| 1804 | 1512 |
| 1805 | 1512 |
| 1806 | 1516 |
| 1807 | 1522 |
| 1808 | 1524 |
| 1809 | 1531 |
| 1810 | 1533 |
| 1811 | 1534 |
| 1812 | 1534 |
| 1813 | 1531 |
| 1814 | 1529 |
| 1815 | 1528 |
| 1816 | 1528 |
| 1817 | 1524 |
| 1818 | 1523 |
| 1819 | 1519 |
| 1820 | 1516 |
| 1821 | 1512 |
| 1822 | 1507 |
| 1823 | 1484 |
| 1824 | 1420 |
| 1825 | 1436 |
| 1826 | 1420 |
| 1827 | 1423 |
| 1828 | 1438 |
| 1829 | 1437 |
| 1830 | 1440 |
| 1831 | 1440 |
| 1832 | 1438 |
| 1833 | 1440 |
| 1834 | 1439 |
| 1835 | 1436 |
| 1836 | 1436 |
| 1837 | 1441 |
| 1838 | 1440 |
| 1839 | 1445 |
| 1840 | 1453 |
| 1841 | 1457 |
| 1842 | 1529.532 |
| 1843 | 1605.674 |
| 1844 | 1685.607 |
| 1845 | 1769.519 |
| 1846 | 1857.609 |
| 1847 | 1950.084 |
| 1848 | 2047.162 |
| 1849 | 2149.073 |
| 1850 | 2256.057 |
| 1851 | 2368.367 |
| 1852 | 2486.268 |
| 1853 | 2610.039 |
| 1854 | 2739.971 |
| 1855 | 2876.371 |
| 1856 | 3019.561 |
| 1857 | 3169.879 |
| 1858 | 3327.681 |
| 1859 | 3493.338 |
| 1860 | 3667.242 |
| 1861 | 3849.803 |
| 1862 | 4041.453 |
| 1863 | 4242.642 |
| 1864 | 4453.848 |
| 1865 | 4675.567 |
| 1866 | 4908.325 |
| 1867 | 5152.669 |
| 1868 | 5409.177 |
| 1869 | 5678.454 |
| 1870 | 5961.137 |
| 1871 | 6257.891 |
| 1872 | 6569.419 |
| 1873 | 6896.455 |
| 1874 | 7239.772 |
| 1875 | 7600.179 |
| 1876 | 7978.528 |
| 1877 | 8375.712 |
| 1878 | 8792.668 |
| 1879 | 9230.381 |
| 1880 | 9689.884 |
| 1881 | 10172.261 |
| 1882 | 10678.653 |
| 1883 | 11210.253 |
| 1884 | 11768.317 |
| 1885 | 12354.163 |
| 1886 | 12969.172 |
| 1887 | 13614.798 |
| 1888 | 14292.564 |
| 1889 | 15004.071 |
| 1890 | 15750.997 |
| 1891 | 16535.107 |
| 1892 | 17358.251 |
| 1893 | 18222.372 |
| 1894 | 19129.51 |
| 1895 | 20081.808 |
| 1896 | 21081.512 |
| 1897 | 22130.983 |
| 1898 | 23232.698 |
| 1899 | 24389.259 |
| 1900 | 25603.395 |
| 1901 | 26877.972 |
| 1902 | 28216 |
| 1903 | 30277 |
| 1904 | 30803 |
| 1905 | 30892 |
| 1906 | 31133 |
| 1907 | 31358 |
| 1908 | 31522 |
| 1909 | 31811 |
| 1910 | 32180 |
| 1911 | 32119 |
| 1912 | 32184 |
| 1913 | 32106 |
| 1914 | 32118 |
| 1915 | 32140 |
| 1916 | 32113 |
| 1917 | 32021 |
| 1918 | 31881 |
| 1919 | 31789 |
| 1920 | 31626 |
| 1921 | 31421 |
| 1922 | 30547 |
| 1923 | 28060 |
| 1924 | 26041 |
| 1925 | 24853 |
| 1926 | 23309 |
| 1927 | 20653 |
| 1928 | 18290 |
| 1929 | 16652 |
| 1930 | 14881 |
| 1931 | 13925 |
| 1932 | 11673 |
| 1933 | 10225 |
| 1934 | 9532 |
| 1935 | 8867 |
| 1936 | 7812 |
| 1937 | 6685 |
| 1938 | 6107 |
| 1939 | 5721 |
| 1940 | 5210 |
| 1941 | 4993 |
| 1942 | 4611 |
| 1943 | 4342 |
| 1944 | 4050 |
| 1945 | 3962 |
| 1946 | 3881 |
| 1947 | 3759 |
| 1948 | 3453 |
| 1949 | 3334 |
| 1950 | 3208 |
| 1951 | 3058 |
| 1952 | 2831 |
| 1953 | 2704 |
| 1954 | 2645 |
| 1955 | 2543 |
| 1956 | 2502 |
| 1957 | 2350 |
| 1958 | 2211 |
| 1959 | 2106 |
| 1960 | 2041 |
| 1961 | 1990 |
| 1962 | 1962 |
| 1963 | 1939 |
| 1964 | 1931 |
| 1965 | 1920 |
| 1966 | 1900 |
| 1967 | 1873 |
| 1968 | 1856 |
| 1969 | 1825 |
| 1970 | 1769 |
| 1971 | 1751 |
| 1972 | 1730 |
| 1973 | 1710 |
| 1974 | 1696 |
| 1975 | 1687 |
| 1976 | 1675 |
| 1977 | 1667 |
| 1978 | 1658 |
| 1979 | 1650 |
| 1980 | 1646 |
| 1981 | 1634 |
| 1982 | 1621 |
| 1983 | 1621 |
| 1984 | 1622 |
| 1985 | 1616 |
| 1986 | 1617 |
| 1987 | 1617 |
| 1988 | 1618 |
| 1989 | 1619 |
| 1990 | 1622 |
| 1991 | 1625 |
| 1992 | 1627 |
| 1993 | 1628 |
| 1994 | 1630 |
| 1995 | 1633 |
| 1996 | 1634 |
| 1997 | 1634 |
| 1998 | 1631 |
| 1999 | 1629 |
| 2000 | 1627 |
| 2001 | 1623 |
| 2002 | 1620 |
| 2003 | 1617 |
| 2004 | 1614 |
| 2005 | 1608 |
| 2006 | 1605 |
| 2007 | 1590 |
| 2008 | 1582 |
| 2009 | 1574 |
| 2010 | 1562 |
| 2011 | 1560 |
| 2012 | 1554 |
| 2013 | 1552 |
| 2014 | 1551 |
| 2015 | 1548 |
| 2016 | 1548 |
| 2017 | 1548 |
| 2018 | 1549 |
| 2019 | 1545 |
| 2020 | 1544 |
| 2021 | 1539 |
| 2022 | 1536 |
| 2023 | 1535 |
| 2024 | 1533 |
| 2025 | 1531 |
| 2026 | 1530 |
| 2027 | 1531 |
| 2028 | 1529 |
| 2029 | 1528 |
| 2030 | 1528 |
| 2031 | 1529 |
| 2032 | 1528 |
| 2033 | 1528 |
| 2034 | 1529 |
| 2035 | 1531 |
| 2036 | 1533 |
| 2037 | 1531 |
| 2038 | 1531 |
| 2039 | 1531 |
| 2040 | 1531 |
| 2041 | 1532 |
| 2042 | 1533 |
| 2043 | 1535 |
| 2044 | 1538 |
| 2045 | 1542 |
| 2046 | 1546 |
| 2047 | 1565 |
| 2048 | 1638 |
| 2049 | 1698 |
| 2050 | 1703 |
| 2051 | 1711 |
| 2052 | 1704 |
| 2053 | 1702 |
| 2054 | 1695 |
| 2055 | 1701 |
| 2056 | 1698 |
| 2057 | 1695 |
| 2058 | 1692 |
| 2059 | 1693 |
| 2060 | 1687 |
| 2061 | 1686 |
| 2062 | 1682 |
| 2063 | 1677 |
| 2064 | 1675 |
| 2065 | 1671 |
| 2066 | 1668 |
| 2067 | 1664 |
| 2068 | 1661 |
| 2069 | 1656 |
| 2070 | 1651 |
| 2071 | 1637 |
| 2072 | 1621 |
| 2073 | 1587 |
| 2074 | 1579 |
| 2075 | 1581 |
| 2076 | 1579 |
| 2077 | 1571 |
| 2078 | 1576 |
| 2079 | 1576 |
| 2080 | 1575 |
| 2081 | 1576 |
| 2082 | 1574 |
| 2083 | 1574 |
| 2084 | 1573 |
| 2085 | 1574 |
| 2086 | 1572 |
| 2087 | 1574 |
| 2088 | 1575 |
| 2089 | 1580 |
| 2090 | 1637.68 |
| 2091 | 1697.465 |
| 2092 | 1759.433 |
| 2093 | 1823.663 |
| 2094 | 1890.238 |
| 2095 | 1959.244 |
| 2096 | 2030.768 |
| 2097 | 2104.904 |
| 2098 | 2181.746 |
| 2099 | 2261.393 |
| 2100 | 2343.947 |
| 2101 | 2429.516 |
| 2102 | 2518.208 |
| 2103 | 2610.138 |
| 2104 | 2705.425 |
| 2105 | 2804.189 |
| 2106 | 2906.56 |
| 2107 | 3012.667 |
| 2108 | 3122.648 |
| 2109 | 3236.644 |
| 2110 | 3354.801 |
| 2111 | 3477.272 |
| 2112 | 3604.214 |
| 2113 | 3735.79 |
| 2114 | 3872.169 |
| 2115 | 4013.527 |
| 2116 | 4160.046 |
| 2117 | 4311.913 |
| 2118 | 4469.325 |
| 2119 | 4632.483 |
| 2120 | 4801.597 |
| 2121 | 4976.885 |
| 2122 | 5158.572 |
| 2123 | 5346.891 |
| 2124 | 5542.086 |
| 2125 | 6396.771 |
| 2126 | 6630.293 |
| 2127 | 6872.339 |
| 2128 | 7123.222 |
| 2129 | 7383.263 |
| 2130 | 7652.798 |
| 2131 | 7932.172 |
| 2132 | 8221.746 |
| 2133 | 8521.89 |
| 2134 | 8832.992 |
| 2135 | 9155.45 |
| 2136 | 9489.681 |
| 2137 | 9836.113 |
| 2138 | 10195.191 |
| 2139 | 10567.379 |
| 2140 | 10953.153 |
| 2141 | 11353.011 |
| 2142 | 11767.466 |
| 2143 | 12197.051 |
| 2144 | 12642.318 |
| 2145 | 13103.841 |
| 2146 | 13582.212 |
| 2147 | 14078.046 |
| 2148 | 14591.982 |
| 2149 | 15124.679 |
| 2150 | 15676.823 |
| 2151 | 16249.124 |
| 2152 | 16842.317 |
| 2153 | 17457.166 |
| 2154 | 18094.46 |
| 2155 | 18755.019 |
| 2156 | 21647.367 |
| 2157 | 27823.279 |
| 2158 | 28839 |
| 2159 | 30222 |
| 2160 | 30175 |
| 2161 | 30271 |
| 2162 | 30364 |
| 2163 | 30572 |
| 2164 | 30691 |
| 2165 | 30685 |
| 2166 | 30790 |
| 2167 | 30966 |
| 2168 | 31037 |
| 2169 | 31210 |
| 2170 | 31632 |
| 2171 | 32009 |
| 2172 | 32123 |
| 2173 | 32244 |
| 2174 | 32354 |
| 2175 | 32427 |
| 2176 | 32460 |
| 2177 | 32465 |
| 2178 | 32451 |
| 2179 | 32442 |
| 2180 | 32396 |
| 2181 | 32377 |
| 2182 | 32357 |
| 2183 | 32302 |
| 2184 | 32283 |
| 2185 | 32308 |
| 2186 | 32317 |
| 2187 | 32273 |
| 2188 | 32265 |
| 2189 | 32248 |
| 2190 | 32195 |
| 2191 | 32108 |
| 2192 | 31869 |
| 2193 | 31144 |
| 2194 | 28422 |
| 2195 | 24222 |
| 2196 | 20819 |
| 2197 | 18938 |
| 2198 | 16448 |
| 2199 | 14728 |
| 2200 | 12750 |
| 2201 | 11591 |
| 2202 | 10247 |
| 2203 | 9316 |
| 2204 | 8652 |
| 2205 | 7870 |
| 2206 | 7337 |
| 2207 | 6691 |
| 2208 | 6165 |
| 2209 | 5537 |
| 2210 | 5202 |
| 2211 | 4739 |
| 2212 | 4483 |
| 2213 | 4114 |
| 2214 | 3935 |
| 2215 | 3476 |
| 2216 | 3249 |
| 2217 | 3109 |
| 2218 | 2999 |
| 2219 | 2811 |
| 2220 | 2553 |
| 2221 | 2496 |
| 2222 | 2453 |
| 2223 | 2406 |
| 2224 | 2337 |
| 2225 | 2263 |
| 2226 | 2199 |
| 2227 | 2104 |
| 2228 | 2004 |
| 2229 | 1968 |
| 2230 | 1937 |
| 2231 | 1918 |
| 2232 | 1928 |
| 2233 | 1915 |
| 2234 | 1918 |
| 2235 | 1912 |
| 2236 | 1904 |
| 2237 | 1901 |
| 2238 | 1899 |
| 2239 | 1893 |
| 2240 | 1879 |
| 2241 | 1873 |
| 2242 | 1863 |
| 2243 | 1854 |
| 2244 | 1825 |
| 2245 | 1772 |
| 2246 | 1740 |
| 2247 | 1735 |
| 2248 | 1726 |
| 2249 | 1710 |
| 2250 | 1702 |
| 2251 | 1699 |
| 2252 | 1688 |
| 2253 | 1683 |
| 2254 | 1673 |
| 2255 | 1669 |
| 2256 | 1665 |
| 2257 | 1663 |
| 2258 | 1656 |
| 2259 | 1654 |
| 2260 | 1651 |
| 2261 | 1649 |
| 2262 | 1680 |
| 2263 | 1709 |
| 2264 | 1681 |
| 2265 | 1352 |
| 2266 | 1750 |
| 2267 | 1602 |
| 2268 | 1624 |
| 2269 | 1689 |
| 2270 | 1660 |
| 2271 | 1626 |
| 2272 | 1619 |
| 2273 | 1605 |
| 2274 | 1600 |
| 2275 | 1604 |
| 2276 | 1602 |
| 2277 | 1601 |
| 2278 | 1600 |
| 2279 | 1606 |
| 2280 | 1616 |
| 2281 | 1624 |
| 2282 | 1631 |
| 2283 | 1634 |
| 2284 | 1637 |
| 2285 | 1722.963 |
| 2286 | 1813.44 |
| 2287 | 1908.668 |
| 2288 | 2008.897 |
| 2289 | 2114.389 |
| 2290 | 2225.42 |
| 2291 | 2594.74 |
| 2292 | 2730.996 |
| 2293 | 2874.407 |
| 2294 | 3025.349 |
| 2295 | 3184.217 |
| 2296 | 3351.428 |
| 2297 | 3527.42 |
| 2298 | 3712.654 |
| 2299 | 3907.614 |
| 2300 | 4112.812 |
| 2301 | 4328.786 |
| 2302 | 4556.101 |
| 2303 | 4795.353 |
| 2304 | 5047.169 |
| 2305 | 5312.208 |
| 2306 | 5591.165 |
| 2307 | 5884.77 |
| 2308 | 6193.794 |
| 2309 | 6519.045 |
| 2310 | 6861.376 |
| 2311 | 7221.684 |
| 2312 | 7600.912 |
| 2313 | 8000.054 |
| 2314 | 8420.157 |
| 2315 | 8862.319 |
| 2316 | 9327.701 |
| 2317 | 9817.522 |
| 2318 | 10333.064 |
| 2319 | 10875.678 |
| 2320 | 11446.786 |
| 2321 | 12047.885 |
| 2322 | 12680.548 |
| 2323 | 13346.435 |
| 2324 | 14047.289 |
| 2325 | 14784.946 |
| 2326 | 15561.339 |
| 2327 | 16378.503 |
| 2328 | 17238.578 |
| 2329 | 18143.818 |
| 2330 | 19096.594 |
| 2331 | 20099.402 |
| 2332 | 21154.871 |
| 2333 | 22265.764 |
| 2334 | 23434.994 |
| 2335 | 24665.622 |
| 2336 | 27324.143 |
| 2337 | 28759 |
| 2338 | 29766 |
| 2339 | 30165 |
| 2340 | 30264 |
| 2341 | 30369 |
| 2342 | 30455 |
| 2343 | 30625 |
| 2344 | 30795 |
| 2345 | 30970 |
| 2346 | 31157 |
| 2347 | 31267 |
| 2348 | 31384 |
| 2349 | 31401 |
| 2350 | 31400 |
| 2351 | 31201 |
| 2352 | 31120 |
| 2353 | 30959 |
| 2354 | 30688 |
| 2355 | 29848 |
| 2356 | 27866 |
| 2357 | 24642 |
| 2358 | 22071 |
| 2359 | 19815 |
| 2360 | 16150 |
| 2361 | 15105 |
| 2362 | 14070 |
| 2363 | 12326 |
| 2364 | 10912 |
| 2365 | 10040 |
| 2366 | 9422 |
| 2367 | 8529 |
| 2368 | 7819 |
| 2369 | 7121 |
| 2370 | 6733 |
| 2371 | 6104 |
| 2372 | 5648 |
| 2373 | 5105 |
| 2374 | 4793 |
| 2375 | 4344 |
| 2376 | 4096 |
| 2377 | 3691 |
| 2378 | 3421 |
| 2379 | 3163 |
| 2380 | 3068 |
| 2381 | 2939 |
| 2382 | 2724 |
| 2383 | 2463 |
| 2384 | 2301 |
| 2385 | 2154 |
| 2386 | 2030 |
| 2387 | 1996 |
| 2388 | 1966 |
| 2389 | 1952 |
| 2390 | 1901 |